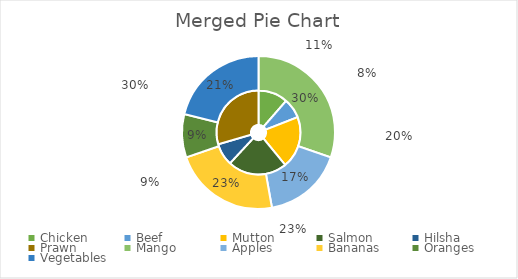
| Category | Container 1 ( kg) | Container 2 ( kg) |
|---|---|---|
| Chicken | 120 | 0 |
| Beef | 80 | 0 |
| Mutton | 210 | 0 |
| Salmon | 240 | 0 |
| Hilsha | 90 | 0 |
| Prawn | 310 | 0 |
| Mango | 0 | 430 |
| Apples | 0 | 240 |
| Bananas | 0 | 320 |
| Oranges | 0 | 130 |
| Vegetables | 0 | 300 |